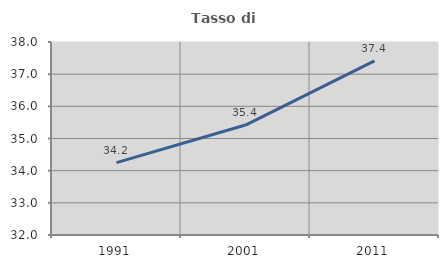
| Category | Tasso di occupazione   |
|---|---|
| 1991.0 | 34.249 |
| 2001.0 | 35.418 |
| 2011.0 | 37.414 |